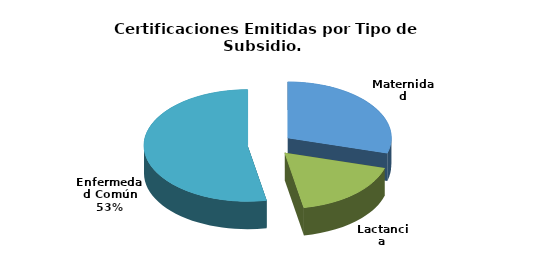
| Category | Total |
|---|---|
| Maternidad | 10 |
| Lactancia | 6 |
| Enfermedad Común | 18 |